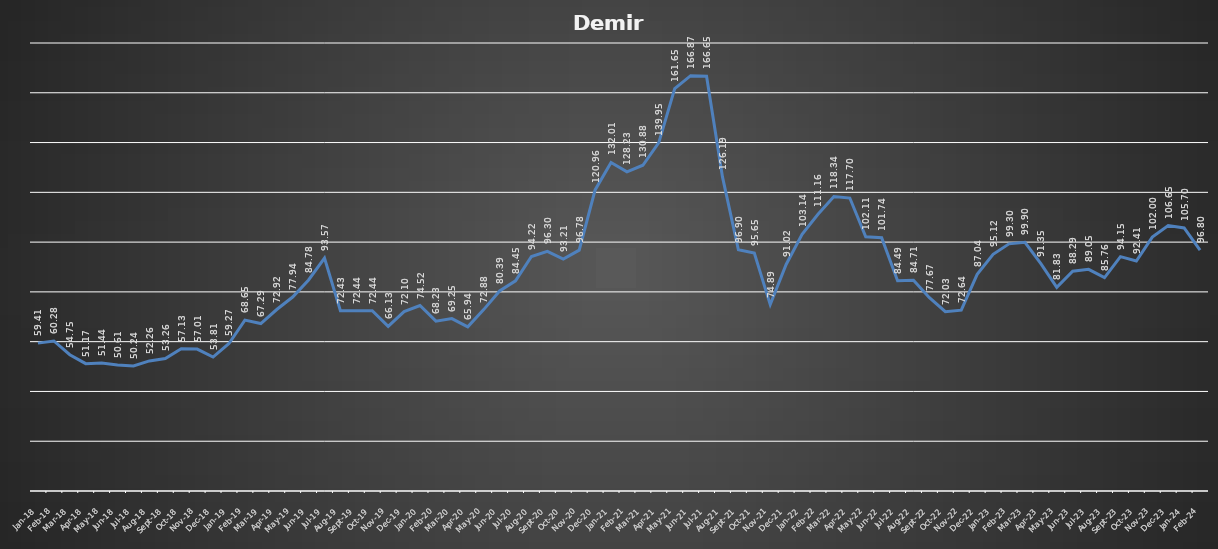
| Category | Series 0 |
|---|---|
| 2018-01-31 | 59.409 |
| 2018-02-28 | 60.28 |
| 2018-03-31 | 54.747 |
| 2018-04-30 | 51.167 |
| 2018-05-31 | 51.44 |
| 2018-06-30 | 50.615 |
| 2018-07-31 | 50.241 |
| 2018-08-31 | 52.257 |
| 2018-09-30 | 53.261 |
| 2018-10-31 | 57.128 |
| 2018-11-30 | 57.012 |
| 2018-12-31 | 53.813 |
| 2019-01-31 | 59.268 |
| 2019-02-28 | 68.654 |
| 2019-03-31 | 67.292 |
| 2019-04-30 | 72.918 |
| 2019-05-31 | 77.938 |
| 2019-06-30 | 84.778 |
| 2019-07-31 | 93.572 |
| 2019-08-31 | 72.428 |
| 2019-09-30 | 72.436 |
| 2019-10-31 | 72.436 |
| 2019-11-30 | 66.132 |
| 2019-12-31 | 72.101 |
| 2020-01-31 | 74.521 |
| 2020-02-29 | 68.233 |
| 2020-03-31 | 69.253 |
| 2020-04-30 | 65.938 |
| 2020-05-31 | 72.879 |
| 2020-06-30 | 80.389 |
| 2020-07-31 | 84.451 |
| 2020-08-31 | 94.218 |
| 2020-09-30 | 96.304 |
| 2020-10-31 | 93.214 |
| 2020-11-30 | 96.778 |
| 2020-12-31 | 120.957 |
| 2021-01-31 | 132.008 |
| 2021-02-28 | 128.226 |
| 2021-03-31 | 130.879 |
| 2021-04-30 | 139.946 |
| 2021-05-31 | 161.65 |
| 2021-06-30 | 166.872 |
| 2021-07-31 | 166.646 |
| 2021-08-31 | 126.195 |
| 2021-09-30 | 96.903 |
| 2021-10-31 | 95.65 |
| 2021-11-30 | 74.895 |
| 2021-12-31 | 91.019 |
| 2022-01-31 | 103.136 |
| 2022-02-28 | 111.16 |
| 2022-03-31 | 118.342 |
| 2022-04-30 | 117.704 |
| 2022-05-31 | 102.109 |
| 2022-06-30 | 101.743 |
| 2022-07-31 | 84.49 |
| 2022-08-31 | 84.708 |
| 2022-09-30 | 77.665 |
| 2022-10-31 | 72.031 |
| 2022-11-30 | 72.638 |
| 2022-12-31 | 87.035 |
| 2023-01-31 | 95.121 |
| 2023-02-28 | 99.3 |
| 2023-03-31 | 99.899 |
| 2023-04-30 | 91.354 |
| 2023-05-31 | 81.829 |
| 2023-06-30 | 88.288 |
| 2023-07-31 | 89.051 |
| 2023-08-31 | 85.759 |
| 2023-09-30 | 94.148 |
| 2023-10-31 | 92.412 |
| 2023-11-30 | 102 |
| 2023-12-31 | 106.654 |
| 2024-01-31 | 105.696 |
| 2024-02-29 | 96.802 |